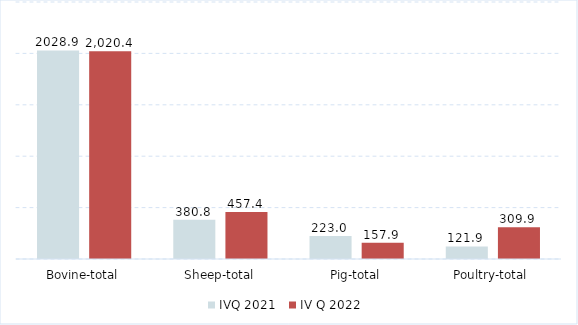
| Category | IVQ 2021 | IV Q 2022 |
|---|---|---|
| Bovine-total | 2028.923 | 2020.4 |
| Sheep-total | 380.8 | 457.4 |
| Pig-total | 222.985 | 157.9 |
| Poultry-total | 121.9 | 309.9 |